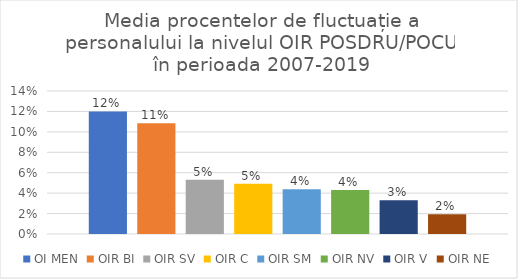
| Category | OI MEN | OIR BI | OIR SV | OIR C | OIR SM | OIR NV | OIR V | OIR NE |
|---|---|---|---|---|---|---|---|---|
| 0 | 0.12 | 0.108 | 0.053 | 0.049 | 0.044 | 0.043 | 0.033 | 0.019 |